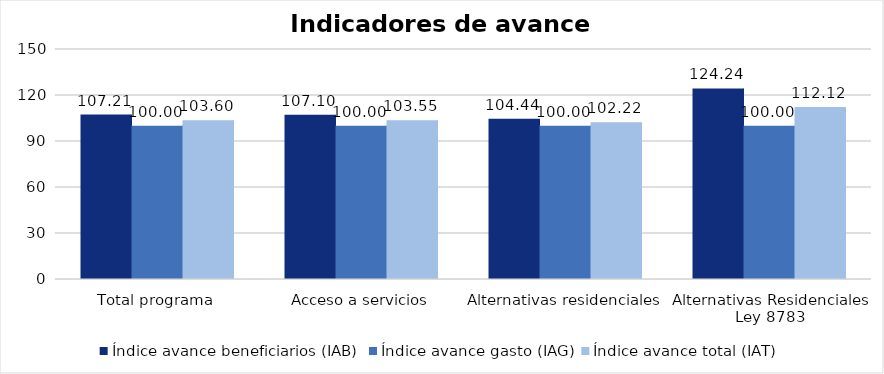
| Category | Índice avance beneficiarios (IAB)  | Índice avance gasto (IAG) | Índice avance total (IAT)  |
|---|---|---|---|
| Total programa | 107.208 | 100 | 103.604 |
| Acceso a servicios | 107.098 | 100.003 | 103.551 |
| Alternativas residenciales | 104.435 | 100 | 102.218 |
| Alternativas Residenciales Ley 8783 | 124.242 | 100 | 112.121 |